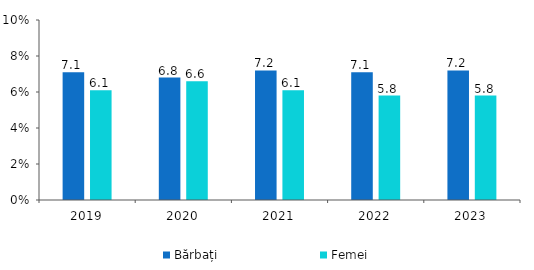
| Category | Bărbați | Femei |
|---|---|---|
| 2019.0 | 7.1 | 6.1 |
| 2020.0 | 6.8 | 6.6 |
| 2021.0 | 7.2 | 6.1 |
| 2022.0 | 7.1 | 5.8 |
| 2023.0 | 7.2 | 5.8 |